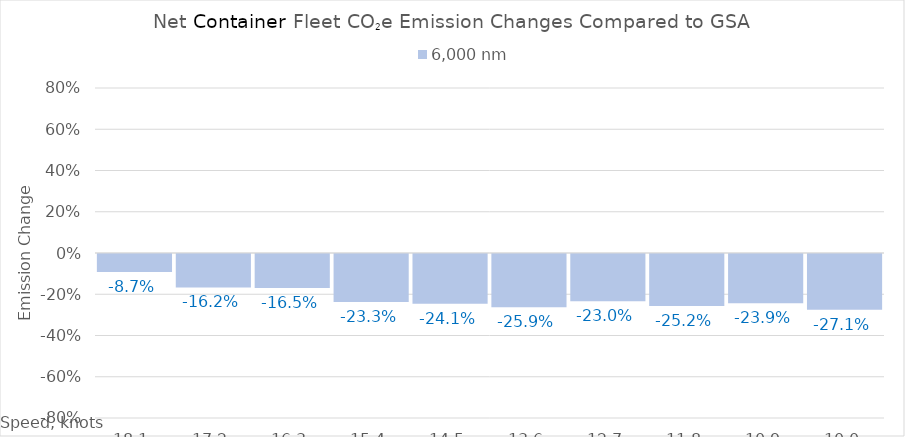
| Category | 6,000 |
|---|---|
| 18.1 | -0.087 |
| 17.200000000000003 | -0.162 |
| 16.300000000000004 | -0.165 |
| 15.400000000000004 | -0.233 |
| 14.500000000000004 | -0.241 |
| 13.600000000000003 | -0.259 |
| 12.700000000000003 | -0.23 |
| 11.800000000000002 | -0.252 |
| 10.900000000000002 | -0.239 |
| 10.000000000000002 | -0.271 |